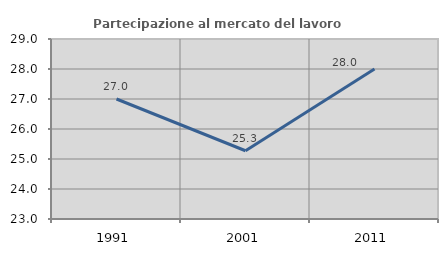
| Category | Partecipazione al mercato del lavoro  femminile |
|---|---|
| 1991.0 | 27 |
| 2001.0 | 25.275 |
| 2011.0 | 28 |